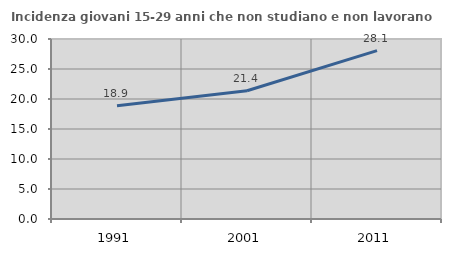
| Category | Incidenza giovani 15-29 anni che non studiano e non lavorano  |
|---|---|
| 1991.0 | 18.889 |
| 2001.0 | 21.371 |
| 2011.0 | 28.07 |